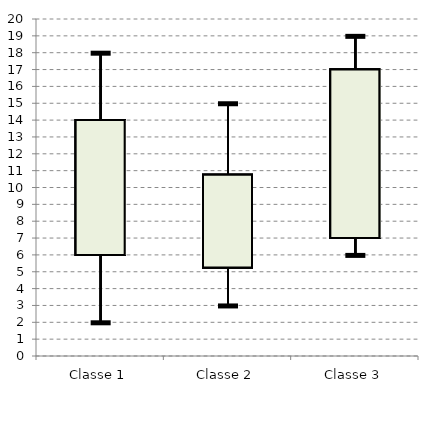
| Category | Q1 | Min | Méd | Max | Moy | Q3 |
|---|---|---|---|---|---|---|
| Classe 1 | 6 | 2 | 10 | 18 | 10 | 14 |
| Classe 2 | 5.25 | 3 | 9 | 15 | 8.2 | 10.75 |
| Classe 3 | 7 | 6 | 12 | 19 | 12.367 | 17 |